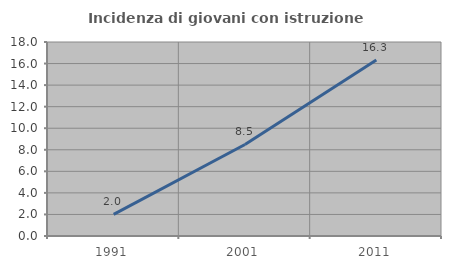
| Category | Incidenza di giovani con istruzione universitaria |
|---|---|
| 1991.0 | 2.008 |
| 2001.0 | 8.491 |
| 2011.0 | 16.332 |